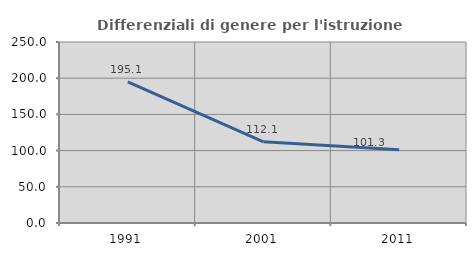
| Category | Differenziali di genere per l'istruzione superiore |
|---|---|
| 1991.0 | 195.069 |
| 2001.0 | 112.144 |
| 2011.0 | 101.34 |